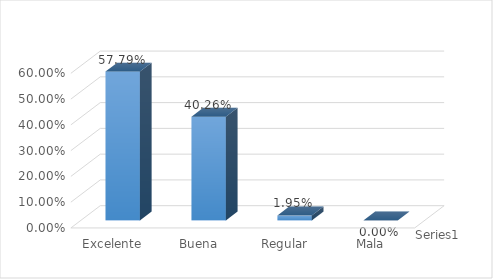
| Category | Series 0 |
|---|---|
| Excelente | 0.578 |
| Buena | 0.403 |
| Regular | 0.019 |
| Mala | 0 |